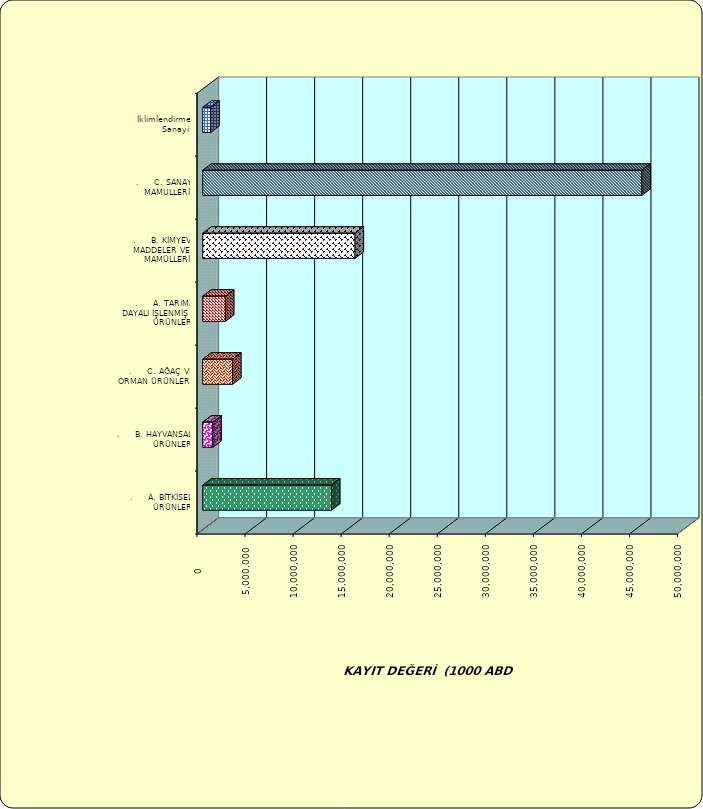
| Category | Series 0 |
|---|---|
| .     A. BİTKİSEL ÜRÜNLER | 13402188.958 |
| .     B. HAYVANSAL ÜRÜNLER | 1060699.652 |
| .     C. AĞAÇ VE ORMAN ÜRÜNLERİ | 3112712.816 |
| .     A. TARIMA DAYALI İŞLENMİŞ ÜRÜNLER | 2366074.828 |
| .     B. KİMYEVİ MADDELER VE MAMÜLLERİ | 15854949.678 |
| .     C. SANAYİ MAMULLERİ | 45697795.935 |
|  İklimlendirme Sanayii | 832122.038 |